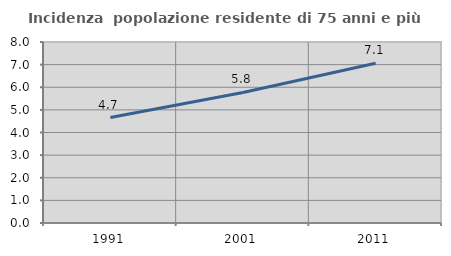
| Category | Incidenza  popolazione residente di 75 anni e più |
|---|---|
| 1991.0 | 4.663 |
| 2001.0 | 5.769 |
| 2011.0 | 7.064 |